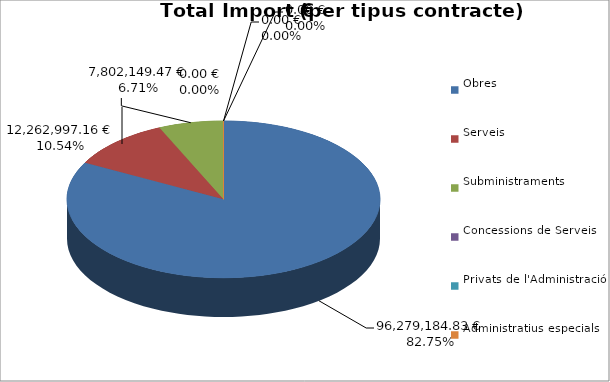
| Category | Total preu
(amb IVA) |
|---|---|
| Obres | 96279184.83 |
| Serveis | 12262997.16 |
| Subministraments | 7802149.47 |
| Concessions de Serveis | 0 |
| Privats de l'Administració | 0 |
| Administratius especials | 0 |